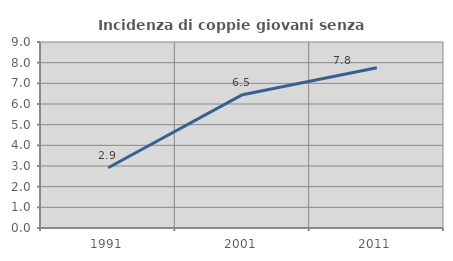
| Category | Incidenza di coppie giovani senza figli |
|---|---|
| 1991.0 | 2.913 |
| 2001.0 | 6.452 |
| 2011.0 | 7.752 |